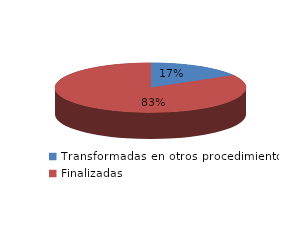
| Category | Series 0 |
|---|---|
| Transformadas en otros procedimientos | 1070 |
| Finalizadas | 5390 |